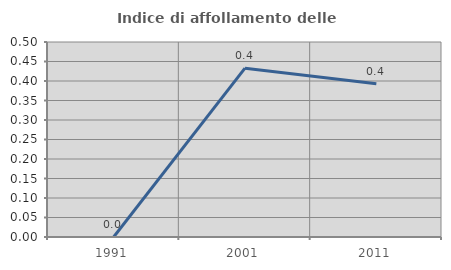
| Category | Indice di affollamento delle abitazioni  |
|---|---|
| 1991.0 | 0 |
| 2001.0 | 0.433 |
| 2011.0 | 0.393 |